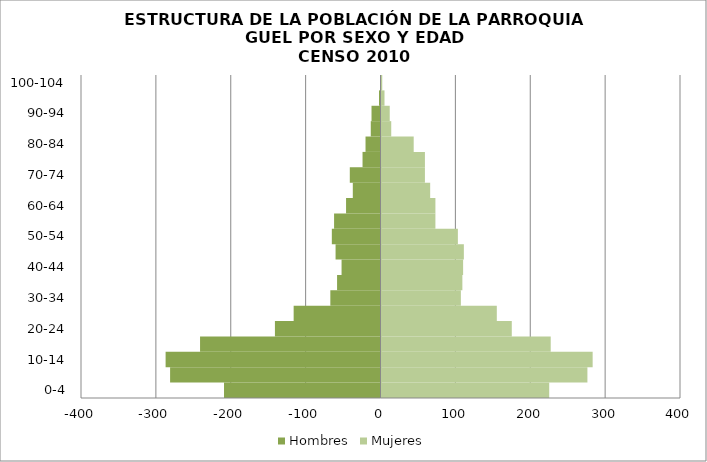
| Category | Hombres | Mujeres |
|---|---|---|
| 0-4 | -209 | 224 |
| 5-9 | -281 | 275 |
| 10-14 | -287 | 282 |
| 15-19 | -241 | 226 |
| 20-24 | -141 | 174 |
| 25-29 | -116 | 154 |
| 30-34 | -67 | 106 |
| 35-39 | -58 | 108 |
| 40-44 | -52 | 109 |
| 45-49 | -60 | 110 |
| 50-54 | -65 | 102 |
| 55-59 | -62 | 72 |
| 60-64 | -46 | 72 |
| 65-69 | -37 | 65 |
| 70-74 | -41 | 58 |
| 75-79 | -24 | 58 |
| 80-84 | -20 | 43 |
| 85-89 | -13 | 13 |
| 90-94 | -12 | 11 |
| 95-99 | -2 | 4 |
| 100-104 | 0 | 1 |